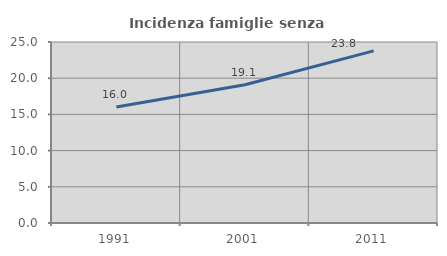
| Category | Incidenza famiglie senza nuclei |
|---|---|
| 1991.0 | 16.018 |
| 2001.0 | 19.105 |
| 2011.0 | 23.775 |